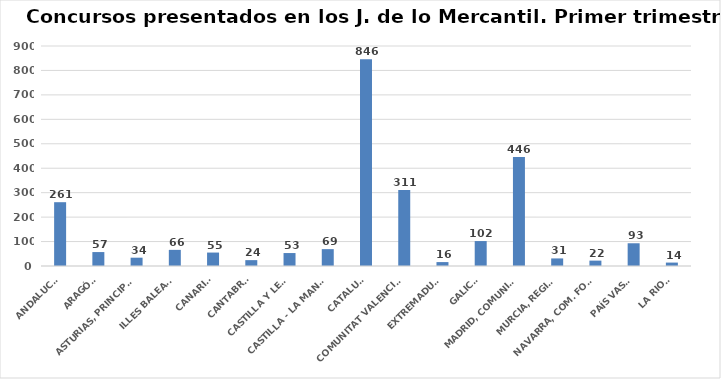
| Category | Series 0 |
|---|---|
| ANDALUCÍA | 261 |
| ARAGÓN | 57 |
| ASTURIAS, PRINCIPADO | 34 |
| ILLES BALEARS | 66 |
| CANARIAS | 55 |
| CANTABRIA | 24 |
| CASTILLA Y LEÓN | 53 |
| CASTILLA - LA MANCHA | 69 |
| CATALUÑA | 846 |
| COMUNITAT VALENCIANA | 311 |
| EXTREMADURA | 16 |
| GALICIA | 102 |
| MADRID, COMUNIDAD | 446 |
| MURCIA, REGIÓN | 31 |
| NAVARRA, COM. FORAL | 22 |
| PAÍS VASCO | 93 |
| LA RIOJA | 14 |